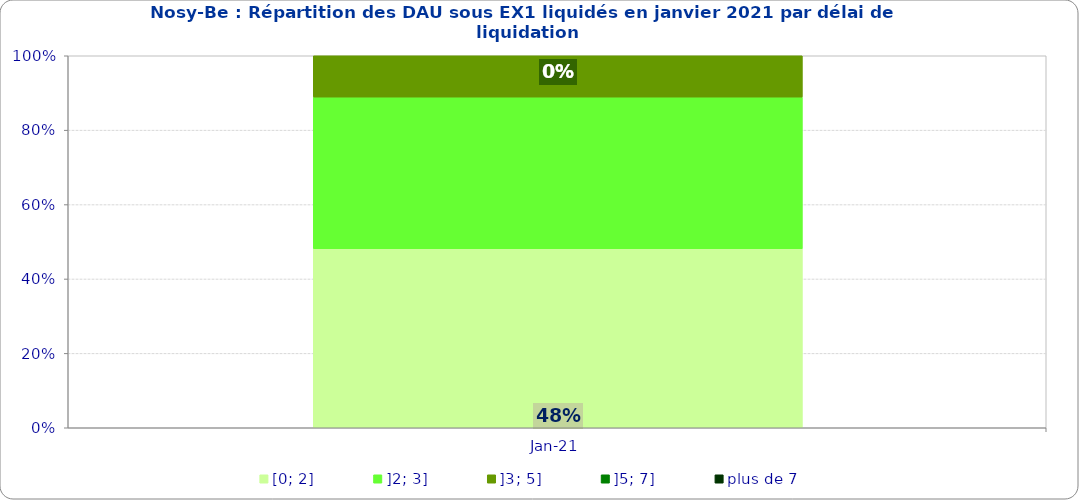
| Category | [0; 2] | ]2; 3] | ]3; 5] | ]5; 7] | plus de 7 |
|---|---|---|---|---|---|
| 2021-01-01 | 0.481 | 0.407 | 0.111 | 0 | 0 |